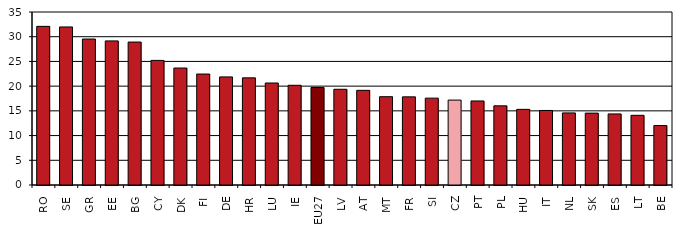
| Category | Series 0 |
|---|---|
| RO | 32.092 |
| SE | 31.977 |
| GR | 29.529 |
| EE | 29.15 |
| BG | 28.919 |
| CY | 25.207 |
| DK | 23.665 |
| FI | 22.449 |
| DE | 21.866 |
| HR | 21.678 |
| LU | 20.635 |
| IE | 20.172 |
| EU27 | 19.723 |
| LV | 19.367 |
| AT | 19.151 |
| MT | 17.866 |
| FR | 17.831 |
| SI | 17.573 |
| CZ | 17.178 |
| PT | 17.002 |
| PL | 16.016 |
| HU | 15.302 |
| IT | 15.081 |
| NL | 14.588 |
| SK | 14.541 |
| ES | 14.377 |
| LT | 14.101 |
| BE | 12.025 |